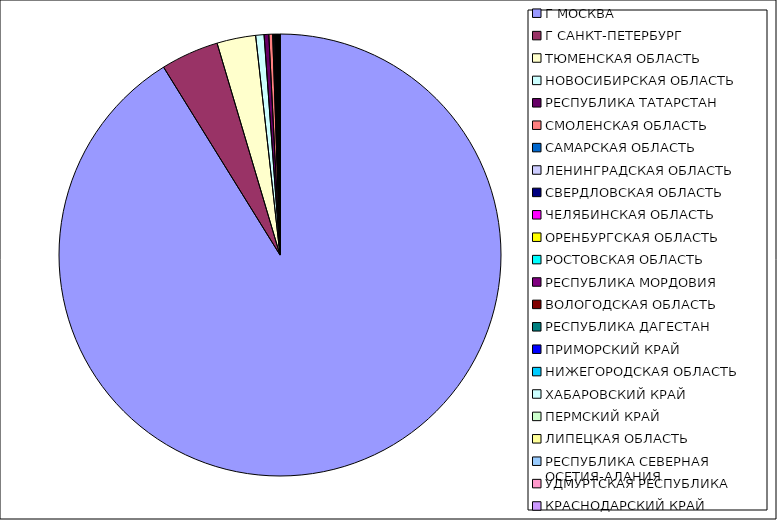
| Category | Оборот |
|---|---|
| Г МОСКВА | 0.911 |
| Г САНКТ-ПЕТЕРБУРГ | 0.042 |
| ТЮМЕНСКАЯ ОБЛАСТЬ | 0.028 |
| НОВОСИБИРСКАЯ ОБЛАСТЬ | 0.006 |
| РЕСПУБЛИКА ТАТАРСТАН | 0.003 |
| СМОЛЕНСКАЯ ОБЛАСТЬ | 0.003 |
| САМАРСКАЯ ОБЛАСТЬ | 0.001 |
| ЛЕНИНГРАДСКАЯ ОБЛАСТЬ | 0.001 |
| СВЕРДЛОВСКАЯ ОБЛАСТЬ | 0.001 |
| ЧЕЛЯБИНСКАЯ ОБЛАСТЬ | 0.001 |
| ОРЕНБУРГСКАЯ ОБЛАСТЬ | 0 |
| РОСТОВСКАЯ ОБЛАСТЬ | 0 |
| РЕСПУБЛИКА МОРДОВИЯ | 0 |
| ВОЛОГОДСКАЯ ОБЛАСТЬ | 0 |
| РЕСПУБЛИКА ДАГЕСТАН | 0 |
| ПРИМОРСКИЙ КРАЙ | 0 |
| НИЖЕГОРОДСКАЯ ОБЛАСТЬ | 0 |
| ХАБАРОВСКИЙ КРАЙ | 0 |
| ПЕРМСКИЙ КРАЙ | 0 |
| ЛИПЕЦКАЯ ОБЛАСТЬ | 0 |
| РЕСПУБЛИКА СЕВЕРНАЯ ОСЕТИЯ-АЛАНИЯ | 0 |
| УДМУРТСКАЯ РЕСПУБЛИКА | 0 |
| КРАСНОДАРСКИЙ КРАЙ | 0 |
| КАРАЧАЕВО-ЧЕРКЕССКАЯ РЕСПУБЛИКА | 0 |
| РЕСПУБЛИКА САХА(ЯКУТИЯ) | 0 |
| РЕСПУБЛИКА БАШКОРТОСТАН | 0 |
| СТАВРОПОЛЬСКИЙ КРАЙ | 0 |
| ИРКУТСКАЯ ОБЛАСТЬ | 0 |